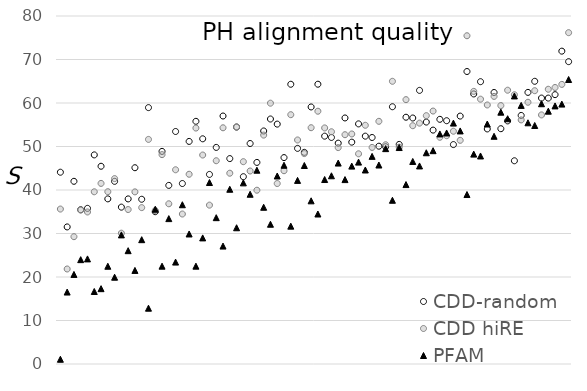
| Category | CDD-random | CDD hiRE | PFAM |
|---|---|---|---|
| 0 | 44.09 | 35.62 | 1.09 |
| 1 | 31.51 | 21.84 | 16.54 |
| 2 | 42 | 29.27 | 20.59 |
| 3 | 35.47 | 35.39 | 23.99 |
| 4 | 35.78 | 34.95 | 24.16 |
| 5 | 48.07 | 39.59 | 16.67 |
| 6 | 45.46 | 41.52 | 17.32 |
| 7 | 37.96 | 39.61 | 22.47 |
| 8 | 41.99 | 42.62 | 19.95 |
| 9 | 36.06 | 30.07 | 29.68 |
| 10 | 37.95 | 35.51 | 26.05 |
| 11 | 45.12 | 39.57 | 21.51 |
| 12 | 37.87 | 35.95 | 28.58 |
| 13 | 58.94 | 51.63 | 12.83 |
| 14 | 35.01 | 35.29 | 35.58 |
| 15 | 48.88 | 48.13 | 22.49 |
| 16 | 41.06 | 36.83 | 33.42 |
| 17 | 53.45 | 44.65 | 23.43 |
| 18 | 41.49 | 34.48 | 36.61 |
| 19 | 51.17 | 43.62 | 29.89 |
| 20 | 55.79 | 54.24 | 22.49 |
| 21 | 51.77 | 48.04 | 28.99 |
| 22 | 43.58 | 36.52 | 41.72 |
| 23 | 49.79 | 46.73 | 33.64 |
| 24 | 57.01 | 54.3 | 27.11 |
| 25 | 47.22 | 43.86 | 40.17 |
| 26 | 54.47 | 54.49 | 31.32 |
| 27 | 43.06 | 46.51 | 41.64 |
| 28 | 50.69 | 44.37 | 39.02 |
| 29 | 46.34 | 39.95 | 44.55 |
| 30 | 53.57 | 52.62 | 36.03 |
| 31 | 56.32 | 59.96 | 32.13 |
| 32 | 55.15 | 41.49 | 43.22 |
| 33 | 47.45 | 44.43 | 45.69 |
| 34 | 64.31 | 57.31 | 31.69 |
| 35 | 49.57 | 51.5 | 42.21 |
| 36 | 48.66 | 48.37 | 45.63 |
| 37 | 59.09 | 54.32 | 37.51 |
| 38 | 64.32 | 58.11 | 34.48 |
| 39 | 52.38 | 54.27 | 42.41 |
| 40 | 52.08 | 53.39 | 43.27 |
| 41 | 50.77 | 49.75 | 46.19 |
| 42 | 56.56 | 52.71 | 42.39 |
| 43 | 51 | 52.88 | 45.49 |
| 44 | 55.2 | 48.32 | 46.41 |
| 45 | 52.38 | 54.88 | 44.6 |
| 46 | 52.07 | 49.79 | 47.73 |
| 47 | 50.07 | 55.79 | 45.74 |
| 48 | 49.95 | 50.4 | 49.51 |
| 49 | 59.14 | 64.99 | 37.64 |
| 50 | 50.48 | 49.85 | 49.76 |
| 51 | 56.73 | 60.77 | 41.25 |
| 52 | 56.55 | 54.78 | 46.56 |
| 53 | 62.9 | 55.37 | 45.53 |
| 54 | 55.62 | 57.09 | 48.56 |
| 55 | 53.77 | 58.15 | 49.04 |
| 56 | 56.25 | 52.12 | 52.89 |
| 57 | 55.93 | 52.48 | 53.11 |
| 58 | 50.44 | 53.51 | 55.38 |
| 59 | 56.99 | 51.42 | 53.58 |
| 60 | 67.24 | 75.46 | 38.96 |
| 61 | 62.08 | 62.67 | 48.25 |
| 62 | 64.9 | 60.88 | 47.82 |
| 63 | 54.04 | 59.55 | 55.17 |
| 64 | 62.42 | 61.52 | 52.35 |
| 65 | 54.09 | 59.41 | 57.89 |
| 66 | 55.89 | 62.94 | 56.38 |
| 67 | 46.72 | 61.9 | 61.62 |
| 68 | 57.14 | 56.11 | 59.45 |
| 69 | 62.44 | 60.17 | 55.45 |
| 70 | 64.99 | 62.83 | 54.83 |
| 71 | 61.13 | 57.26 | 59.83 |
| 72 | 61.13 | 63.16 | 58.12 |
| 73 | 61.92 | 63.57 | 59.33 |
| 74 | 71.92 | 64.28 | 59.75 |
| 75 | 69.51 | 76.17 | 65.4 |